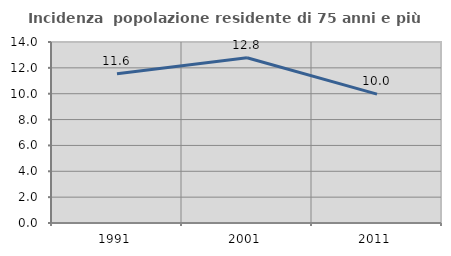
| Category | Incidenza  popolazione residente di 75 anni e più |
|---|---|
| 1991.0 | 11.551 |
| 2001.0 | 12.783 |
| 2011.0 | 9.968 |